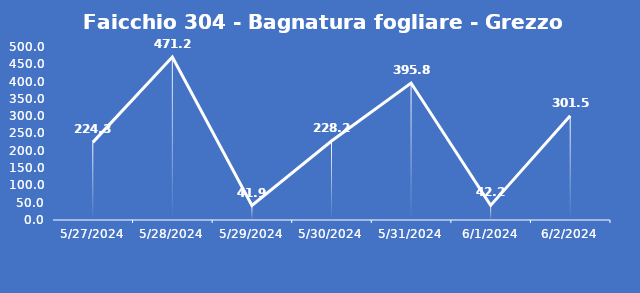
| Category | Faicchio 304 - Bagnatura fogliare - Grezzo (min) |
|---|---|
| 5/27/24 | 224.3 |
| 5/28/24 | 471.2 |
| 5/29/24 | 41.9 |
| 5/30/24 | 228.2 |
| 5/31/24 | 395.8 |
| 6/1/24 | 42.2 |
| 6/2/24 | 301.5 |